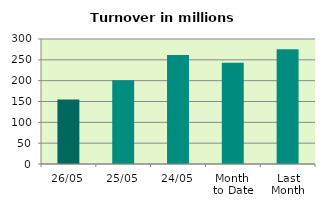
| Category | Series 0 |
|---|---|
| 26/05 | 154.698 |
| 25/05 | 201.051 |
| 24/05 | 261.684 |
| Month 
to Date | 243.027 |
| Last
Month | 275.481 |